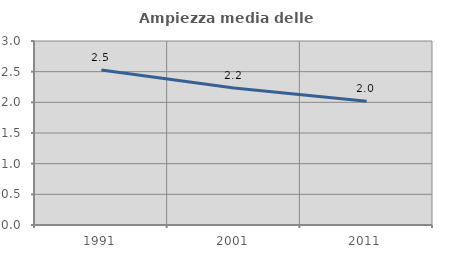
| Category | Ampiezza media delle famiglie |
|---|---|
| 1991.0 | 2.528 |
| 2001.0 | 2.235 |
| 2011.0 | 2.018 |